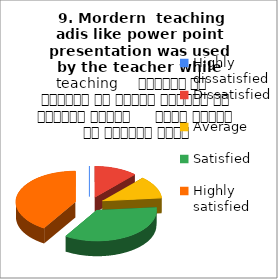
| Category |  9. Mordern  teaching adis like power point presentation was used by the teacher while teaching     शिक्षक ने शिक्षण के दौरान शिक्षण की आधुनिक तकनीक     पावर पॉइंट का प्रयोग किया |
|---|---|
| Highly dissatisfied | 0 |
| Dissatisfied | 2 |
| Average | 2 |
| Satisfied | 6 |
| Highly satisfied | 7 |